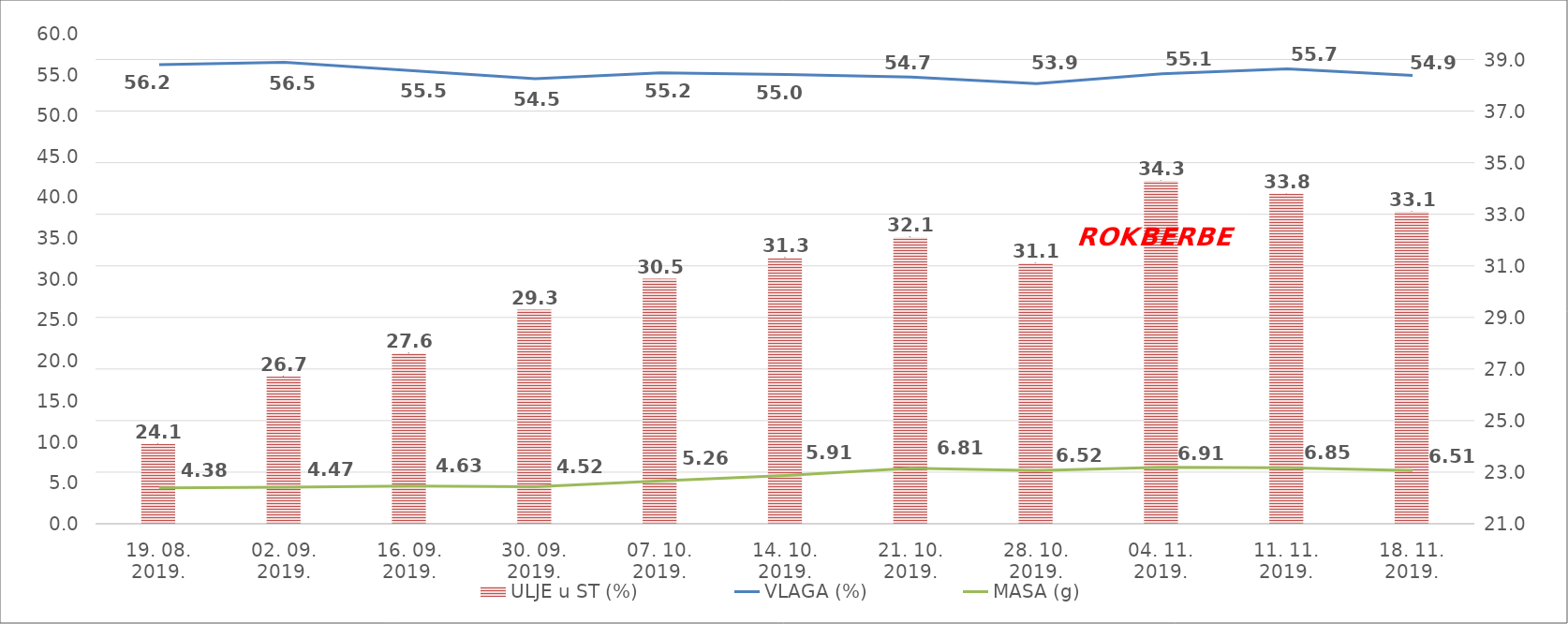
| Category | ULJE u ST (%) |
|---|---|
| 19. 08. 2019. | 24.1 |
| 02. 09. 2019. | 26.7 |
| 16. 09. 2019. | 27.6 |
| 30. 09. 2019. | 29.3 |
| 07. 10. 2019. | 30.5 |
| 14. 10. 2019. | 31.3 |
| 21. 10. 2019. | 32.1 |
| 28. 10. 2019. | 31.1 |
| 04. 11. 2019. | 34.3 |
| 11. 11. 2019. | 33.8 |
| 18. 11. 2019. | 33.1 |